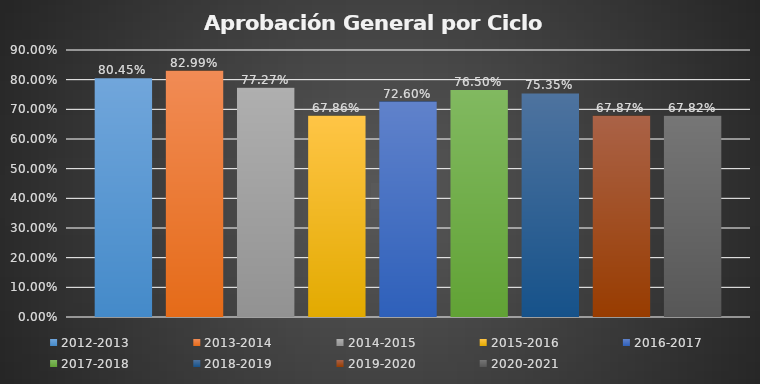
| Category | 2012-2013 | 2013-2014 | 2014-2015 | 2015-2016  | 2016-2017 | 2017-2018 | 2018-2019 | 2019-2020 | 2020-2021 |
|---|---|---|---|---|---|---|---|---|---|
| 0 | 0.804 | 0.83 | 0.773 | 0.679 | 0.726 | 0.765 | 0.754 | 0.679 | 0.678 |